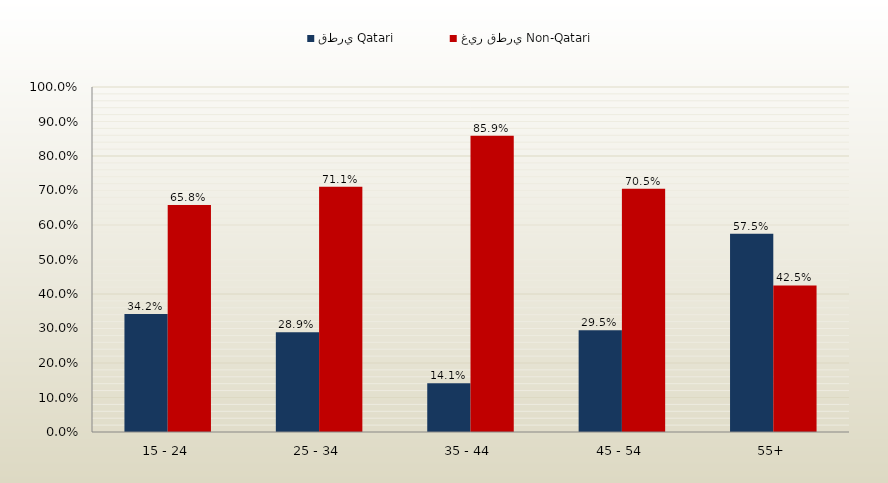
| Category | قطري Qatari | غير قطري Non-Qatari |
|---|---|---|
| 15 - 24 | 0.342 | 0.658 |
| 25 - 34 | 0.289 | 0.711 |
| 35 - 44 | 0.141 | 0.859 |
| 45 - 54 | 0.295 | 0.705 |
| 55+ | 0.575 | 0.425 |